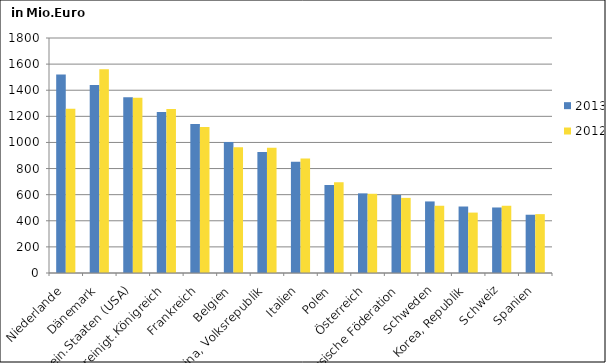
| Category | 2013 | 2012 |
|---|---|---|
| Niederlande | 1520.057 | 1258.019 |
| Dänemark | 1440.519 | 1559.7 |
| Verein.Staaten (USA) | 1346.056 | 1343.1 |
| Vereinigt.Königreich | 1233.936 | 1255.597 |
| Frankreich | 1140.973 | 1118.171 |
| Belgien | 1003.971 | 962.472 |
| China, Volksrepublik | 927.318 | 958.537 |
| Italien | 852.08 | 876.257 |
| Polen | 673.455 | 695.916 |
| Österreich | 610.049 | 606.711 |
| Russische Föderation | 598.118 | 575.336 |
| Schweden | 548.14 | 515.069 |
| Korea, Republik | 509.297 | 462.694 |
| Schweiz | 501.846 | 515.026 |
| Spanien | 446.283 | 450.96 |